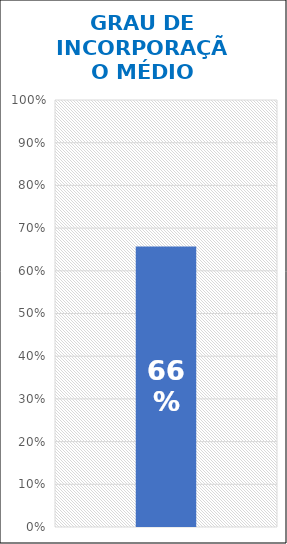
| Category | Grau de Incorporação |
|---|---|
| 0 | 0.657 |